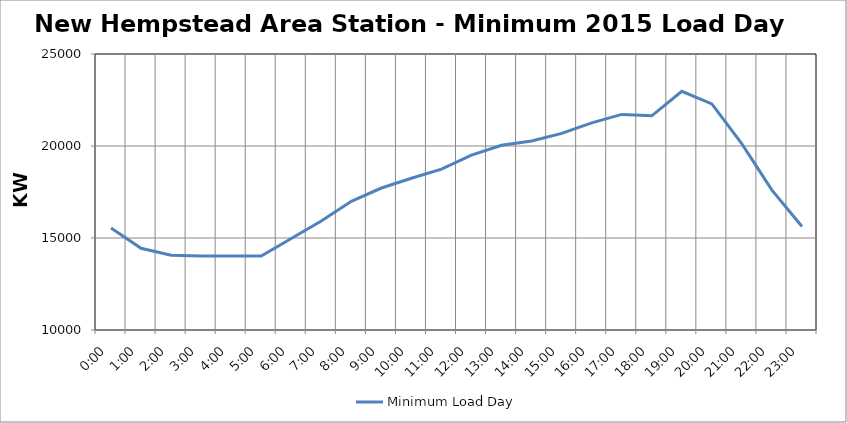
| Category | Minimum Load Day |
|---|---|
| 0.0 | 15544.8 |
| 0.041666666666666664 | 14439.9 |
| 0.08333333333333333 | 14058.9 |
| 0.125 | 14020.8 |
| 0.16666666666666666 | 14020.8 |
| 0.20833333333333334 | 14020.8 |
| 0.25 | 14973.3 |
| 0.2916666666666667 | 15925.8 |
| 0.3333333333333333 | 16992.6 |
| 0.375 | 17716.5 |
| 0.4166666666666667 | 18249.9 |
| 0.4583333333333333 | 18745.2 |
| 0.5 | 19507.2 |
| 0.5416666666666666 | 20040.6 |
| 0.5833333333333334 | 20269.2 |
| 0.625 | 20688.3 |
| 0.6666666666666666 | 21259.8 |
| 0.7083333333333334 | 21717 |
| 0.75 | 21640.8 |
| 0.7916666666666666 | 22974.3 |
| 0.8333333333333334 | 22288.5 |
| 0.875 | 20116.8 |
| 0.9166666666666666 | 17602.2 |
| 0.9583333333333334 | 15621 |